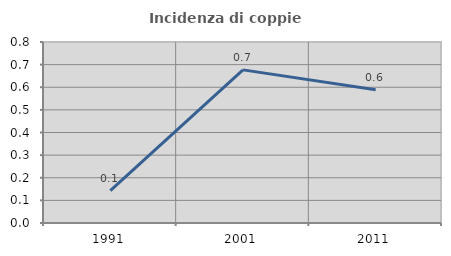
| Category | Incidenza di coppie miste |
|---|---|
| 1991.0 | 0.143 |
| 2001.0 | 0.677 |
| 2011.0 | 0.589 |